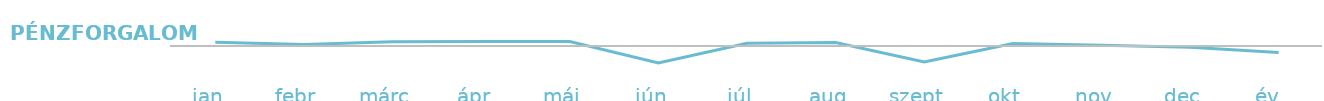
| Category | Készpénzforgalom |
|---|---|
| jan  | 169 |
| febr  | 69 |
| márc  | 192 |
| ápr  | 199 |
| máj  | 204 |
| jún  | -771 |
| júl  | 124 |
| aug  | 154 |
| szept  | -721 |
| okt  | 109 |
| nov  | 34 |
| dec  | -61 |
| év   | -299 |